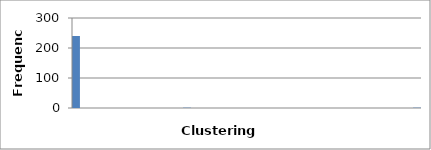
| Category | 240 |
|---|---|
| 0.0 | 240 |
| 0.023255813953488372 | 0 |
| 0.046511627906976744 | 0 |
| 0.06976744186046512 | 0 |
| 0.09302325581395349 | 0 |
| 0.11627906976744186 | 0 |
| 0.13953488372093023 | 0 |
| 0.16279069767441862 | 0 |
| 0.18604651162790697 | 0 |
| 0.20930232558139533 | 0 |
| 0.2325581395348837 | 0 |
| 0.25581395348837205 | 0 |
| 0.2790697674418604 | 0 |
| 0.30232558139534876 | 0 |
| 0.3255813953488371 | 1 |
| 0.3488372093023255 | 0 |
| 0.37209302325581384 | 0 |
| 0.3953488372093022 | 0 |
| 0.41860465116279055 | 0 |
| 0.4418604651162789 | 0 |
| 0.46511627906976727 | 0 |
| 0.4883720930232556 | 0 |
| 0.511627906976744 | 0 |
| 0.5348837209302324 | 0 |
| 0.5581395348837208 | 0 |
| 0.5813953488372092 | 0 |
| 0.6046511627906976 | 0 |
| 0.627906976744186 | 0 |
| 0.6511627906976745 | 0 |
| 0.6744186046511629 | 0 |
| 0.6976744186046513 | 0 |
| 0.7209302325581397 | 0 |
| 0.7441860465116281 | 0 |
| 0.7674418604651165 | 0 |
| 0.790697674418605 | 0 |
| 0.8139534883720934 | 0 |
| 0.8372093023255818 | 0 |
| 0.8604651162790702 | 0 |
| 0.8837209302325586 | 0 |
| 0.906976744186047 | 0 |
| 0.9302325581395354 | 0 |
| 0.9534883720930238 | 0 |
| 0.9767441860465123 | 0 |
| 1.0 | 1 |